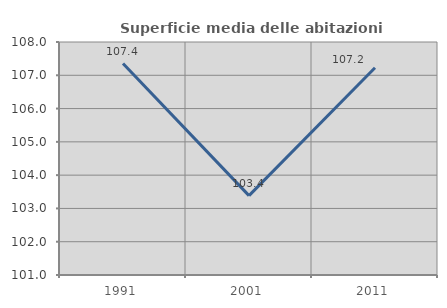
| Category | Superficie media delle abitazioni occupate |
|---|---|
| 1991.0 | 107.354 |
| 2001.0 | 103.385 |
| 2011.0 | 107.228 |